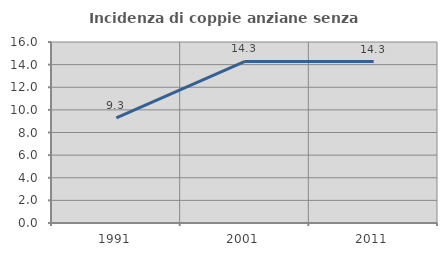
| Category | Incidenza di coppie anziane senza figli  |
|---|---|
| 1991.0 | 9.293 |
| 2001.0 | 14.286 |
| 2011.0 | 14.273 |